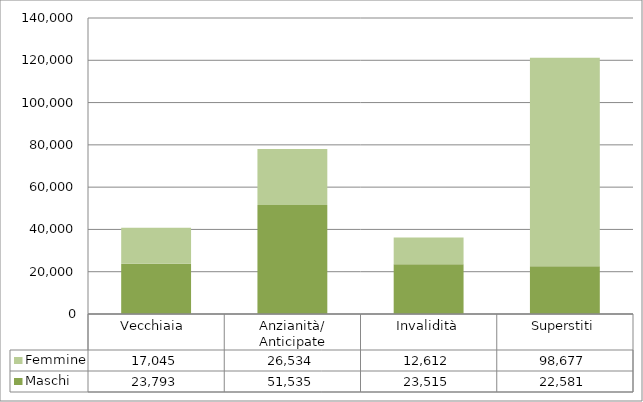
| Category | Maschi | Femmine |
|---|---|---|
| Vecchiaia  | 23793 | 17045 |
| Anzianità/ Anticipate | 51535 | 26534 |
| Invalidità | 23515 | 12612 |
| Superstiti | 22581 | 98677 |